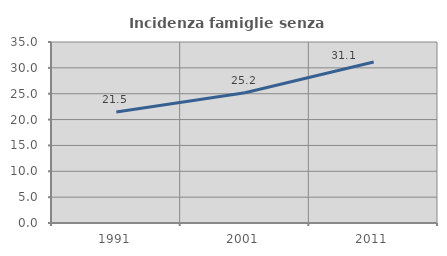
| Category | Incidenza famiglie senza nuclei |
|---|---|
| 1991.0 | 21.472 |
| 2001.0 | 25.185 |
| 2011.0 | 31.122 |